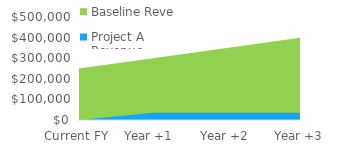
| Category | Baseline Revenue | Project A Revenue |
|---|---|---|
| Current FY | 250000 | 0 |
| Year +1  | 300000 | 35000 |
| Year +2 | 350000 | 35000 |
| Year +3 | 400000 | 35000 |